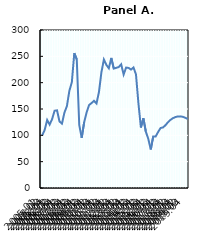
| Category | Petróleo |
|---|---|
| 2005:01 | 100 |
| 2005:02 | 110.279 |
| 2005:03 | 129.087 |
| 2005:04 | 120.434 |
| 2006:01 | 130.755 |
| 2006:02 | 146.706 |
| 2006:03 | 147.415 |
| 2006:04 | 126.376 |
| 2007:01 | 122.227 |
| 2007:02 | 143.161 |
| 2007:03 | 155.442 |
| 2007:04 | 184.591 |
| 2008:01 | 200.813 |
| 2008:02 | 256.026 |
| 2008:03 | 244.266 |
| 2008:04 | 119.871 |
| 2009:01 | 95.329 |
| 2009:02 | 124.896 |
| 2009:03 | 143.599 |
| 2009:04 | 157.506 |
| 2010:01 | 161.322 |
| 2010:02 | 165.575 |
| 2010:03 | 160.467 |
| 2010:04 | 182.339 |
| 2011:01 | 220.017 |
| 2011:02 | 243.932 |
| 2011:03 | 233.716 |
| 2011:04 | 227.314 |
| 2012:01 | 246.977 |
| 2012:02 | 226.772 |
| 2012:03 | 228.148 |
| 2012:04 | 229.629 |
| 2013:01 | 234.862 |
| 2013:02 | 215.492 |
| 2013:03 | 228.628 |
| 2013:04 | 228.003 |
| 2014:01 | 224.917 |
| 2014:02 | 228.857 |
| 2014:03 | 215.721 |
| 2014:04 | 160.696 |
| 2015:01 | 114.95 |
| 2015:02 | 132.402 |
| 2015:03 | 106.964 |
| 2015:04 | 93.223 |
| 2016:01 | 73.146 |
| 2016:02 | 97.938 |
| 2016:03 | 97.953 |
| 2016:04 | 106.604 |
| 2017:01 | 114.015 |
| 2017:02 | 115.025 |
| 2017:03 | 119.448 |
| 2017:04 | 124.987 |
| 2018:01 | 129.388 |
| 2018:02 | 132.584 |
| 2018:03 | 134.708 |
| 2018:04 | 135.914 |
| 2019:01 | 136 |
| 2019:02 | 135.13 |
| 2019:03 | 133.353 |
| 2019:04 | 130.867 |